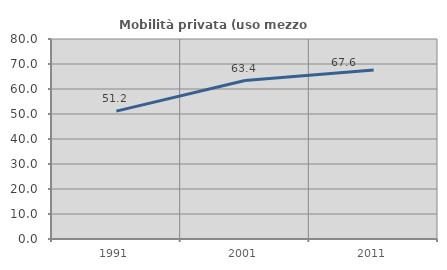
| Category | Mobilità privata (uso mezzo privato) |
|---|---|
| 1991.0 | 51.163 |
| 2001.0 | 63.367 |
| 2011.0 | 67.601 |